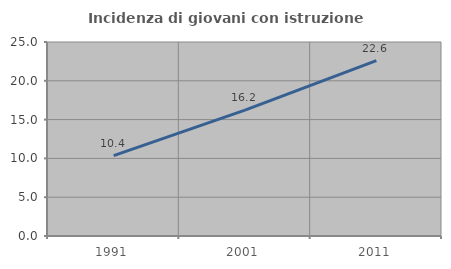
| Category | Incidenza di giovani con istruzione universitaria |
|---|---|
| 1991.0 | 10.357 |
| 2001.0 | 16.228 |
| 2011.0 | 22.599 |